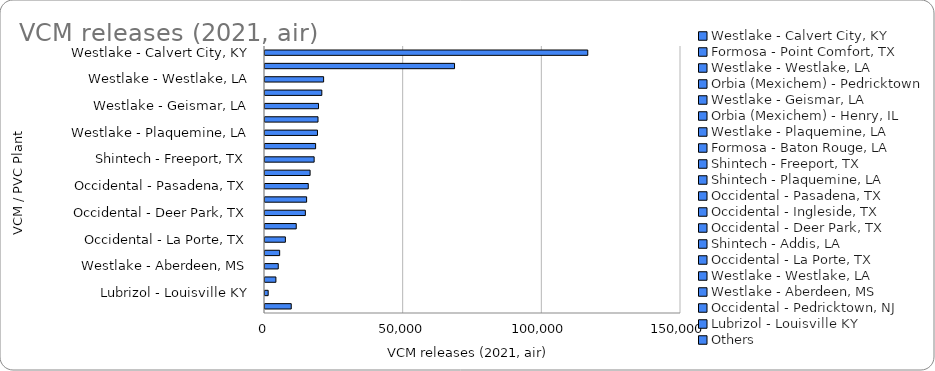
| Category | VCM releases (2021, air) |
|---|---|
| Westlake - Calvert City, KY | 116382 |
| Formosa - Point Comfort, TX | 68346 |
| Westlake - Westlake, LA | 21137 |
| Orbia (Mexichem) - Pedricktown | 20488 |
| Westlake - Geismar, LA | 19300 |
| Orbia (Mexichem) - Henry, IL | 19115 |
| Westlake - Plaquemine, LA | 18922 |
| Formosa - Baton Rouge, LA | 18249 |
| Shintech - Freeport, TX | 17721 |
| Shintech - Plaquemine, LA | 16265 |
| Occidental - Pasadena, TX | 15599 |
| Occidental - Ingleside, TX | 15008 |
| Occidental - Deer Park, TX | 14557 |
| Shintech - Addis, LA | 11264 |
| Occidental - La Porte, TX | 7350 |
| Westlake - Westlake, LA | 5287 |
| Westlake - Aberdeen, MS | 4779 |
| Occidental - Pedricktown, NJ | 3929 |
| Lubrizol - Louisville KY | 1144 |
| Others | 9460 |